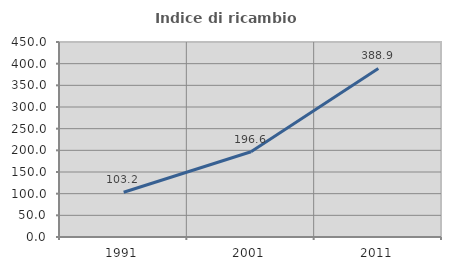
| Category | Indice di ricambio occupazionale  |
|---|---|
| 1991.0 | 103.205 |
| 2001.0 | 196.61 |
| 2011.0 | 388.889 |